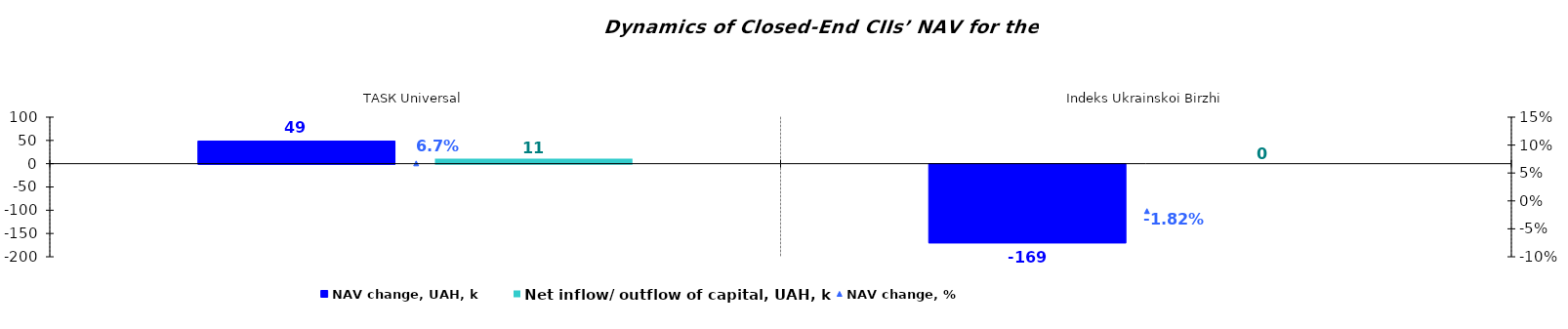
| Category | NAV change, UAH, k | Net inflow/ outflow of capital, UAH, k |
|---|---|---|
| ТАSК Universal | 48.61 | 11.065 |
| Іndeks Ukrainskoi Birzhi | -169.087 | 0 |